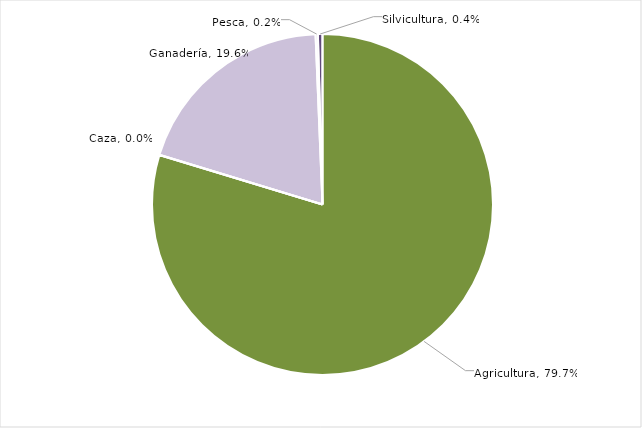
| Category | Series 0 |
|---|---|
| Agricultura | 0.797 |
| Caza | 0 |
| Ganadería | 0.196 |
| Pesca | 0.002 |
| Silvicultura | 0.004 |